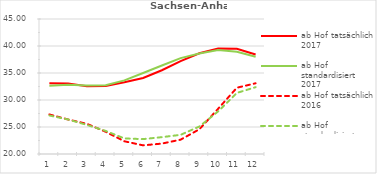
| Category | ab Hof tatsächlich 2017 | ab Hof standardisiert 2017 | ab Hof tatsächlich 2016 | ab Hof standardisiert 2016 |
|---|---|---|---|---|
| 0 | 33.093 | 32.647 | 27.323 | 27.136 |
| 1 | 33.049 | 32.82 | 26.388 | 26.393 |
| 2 | 32.543 | 32.67 | 25.588 | 25.385 |
| 3 | 32.579 | 32.74 | 24.125 | 24.28 |
| 4 | 33.282 | 33.637 | 22.357 | 22.881 |
| 5 | 34.078 | 35.006 | 21.601 | 22.756 |
| 6 | 35.515 | 36.386 | 21.928 | 23.12 |
| 7 | 37.21 | 37.759 | 22.656 | 23.55 |
| 8 | 38.649 | 38.614 | 24.579 | 25.089 |
| 9 | 39.543 | 39.25 | 28.375 | 27.884 |
| 10 | 39.482 | 38.924 | 32.273 | 31.313 |
| 11 | 38.422 | 38.007 | 33.095 | 32.377 |